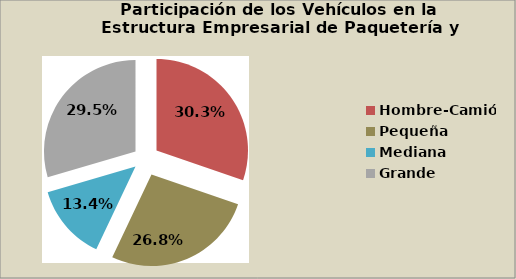
| Category | Series 0 |
|---|---|
| Hombre-Camión | 30.258 |
| Pequeña | 26.797 |
| Mediana | 13.412 |
| Grande | 29.533 |